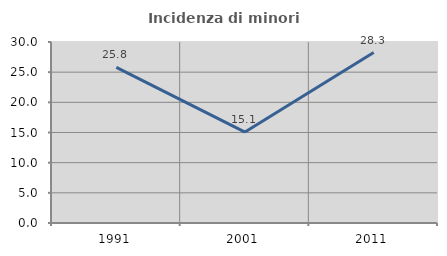
| Category | Incidenza di minori stranieri |
|---|---|
| 1991.0 | 25.806 |
| 2001.0 | 15.068 |
| 2011.0 | 28.254 |